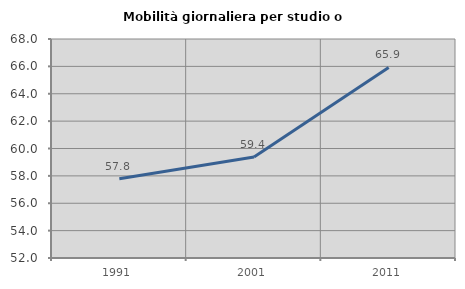
| Category | Mobilità giornaliera per studio o lavoro |
|---|---|
| 1991.0 | 57.79 |
| 2001.0 | 59.38 |
| 2011.0 | 65.921 |